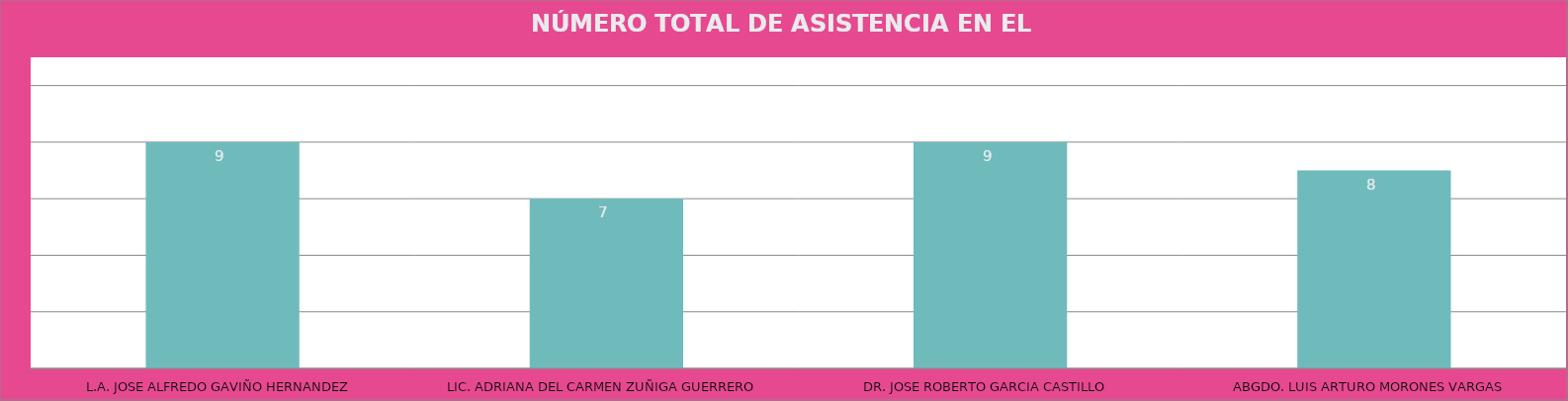
| Category | L.A. JOSE ALFREDO GAVIÑO HERNANDEZ |
|---|---|
| L.A. JOSE ALFREDO GAVIÑO HERNANDEZ | 9 |
| LIC. ADRIANA DEL CARMEN ZUÑIGA GUERRERO | 7 |
| DR. JOSE ROBERTO GARCIA CASTILLO | 9 |
| ABGDO. LUIS ARTURO MORONES VARGAS | 8 |